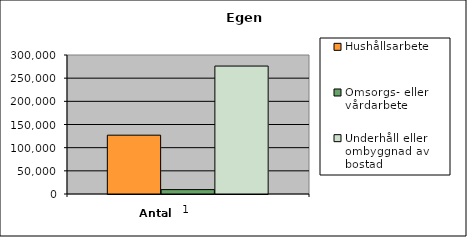
| Category | Hushållsarbete | Omsorgs- eller vårdarbete | Underhåll eller ombyggnad av bostad |
|---|---|---|---|
| 0 | 126966 | 9446 | 276155 |